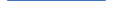
| Category | Series 0 |
|---|---|
| 0 | 3 |
| 1 | 3 |
| 2 | 2 |
| 3 | 4 |
| 4 | 2 |
| 5 | 2 |
| 6 | 1 |
| 7 | 1 |
| 8 | 3 |